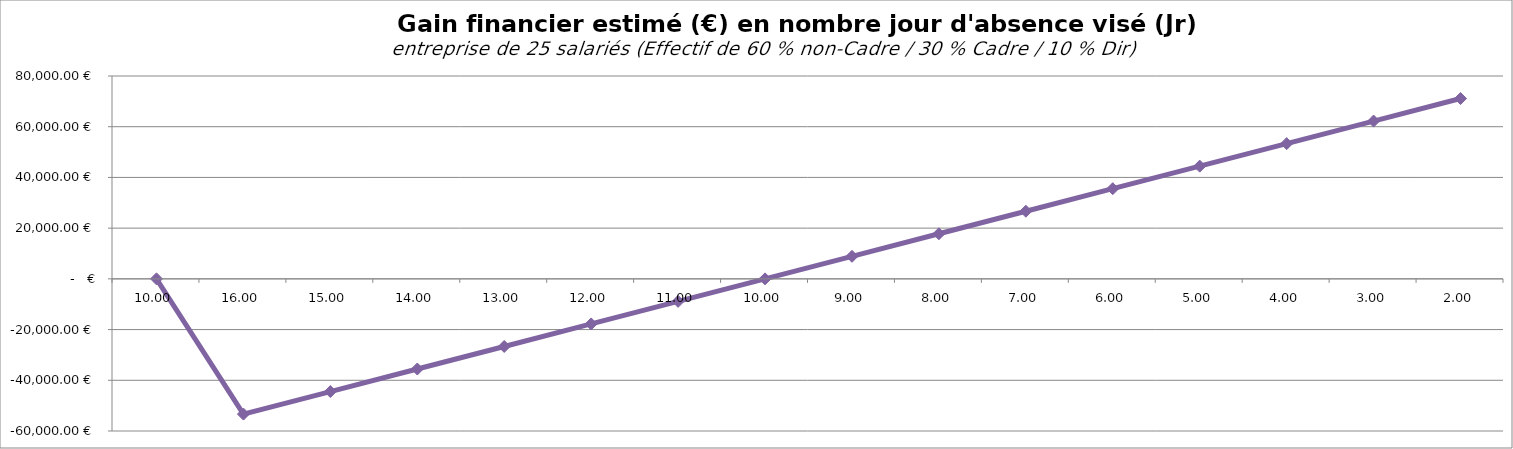
| Category | Series 0 |
|---|---|
| 10.0 | 0 |
| 16.0 | -53336.291 |
| 15.0 | -44446.909 |
| 14.0 | -35557.527 |
| 13.0 | -26668.145 |
| 12.0 | -17778.764 |
| 11.0 | -8889.382 |
| 10.0 | 0 |
| 9.0 | 8889.382 |
| 8.0 | 17778.764 |
| 7.0 | 26668.145 |
| 6.0 | 35557.527 |
| 5.0 | 44446.909 |
| 4.0 | 53336.291 |
| 3.0 | 62225.673 |
| 2.0 | 71115.055 |